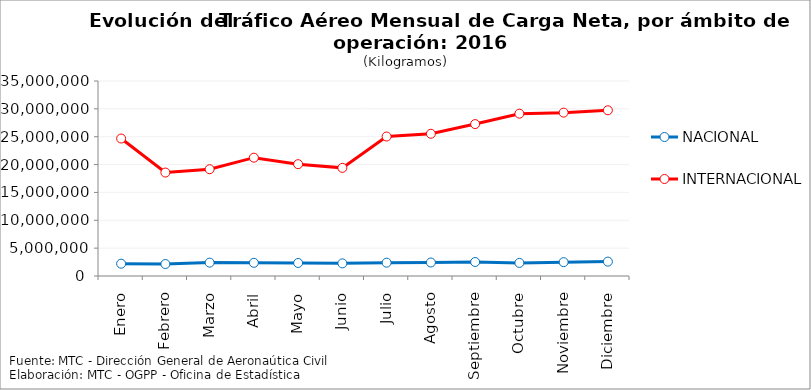
| Category | NACIONAL | INTERNACIONAL |
|---|---|---|
| Enero | 2210187.59 | 24675032 |
| Febrero | 2148455.15 | 18568316 |
| Marzo | 2400681.72 | 19169199 |
| Abril | 2367076.81 | 21238287 |
| Mayo | 2338551.27 | 20072439 |
| Junio | 2268043.03 | 19407992 |
| Julio | 2390204.04 | 25036059 |
| Agosto | 2423635.89 | 25529677 |
| Septiembre | 2513063.13 | 27265919 |
| Octubre | 2352809.42 | 29135072 |
| Noviembre | 2483409.45 | 29322896 |
| Diciembre | 2581107.96 | 29746042 |